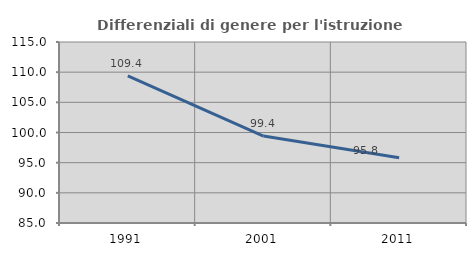
| Category | Differenziali di genere per l'istruzione superiore |
|---|---|
| 1991.0 | 109.367 |
| 2001.0 | 99.405 |
| 2011.0 | 95.82 |